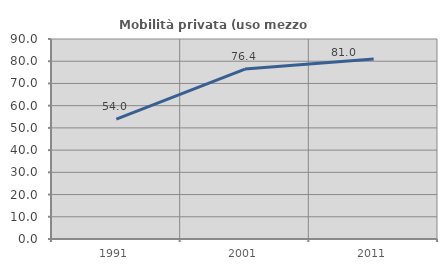
| Category | Mobilità privata (uso mezzo privato) |
|---|---|
| 1991.0 | 53.977 |
| 2001.0 | 76.446 |
| 2011.0 | 80.992 |